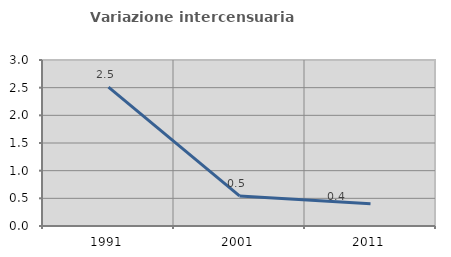
| Category | Variazione intercensuaria annua |
|---|---|
| 1991.0 | 2.508 |
| 2001.0 | 0.544 |
| 2011.0 | 0.4 |